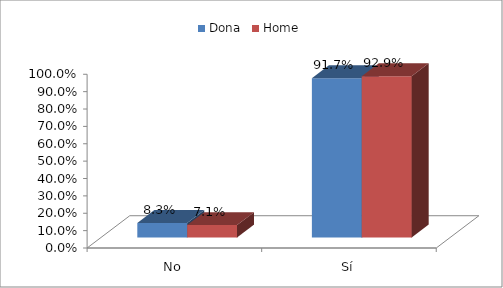
| Category | Dona | Home |
|---|---|---|
| No | 0.083 | 0.071 |
| Sí | 0.917 | 0.929 |